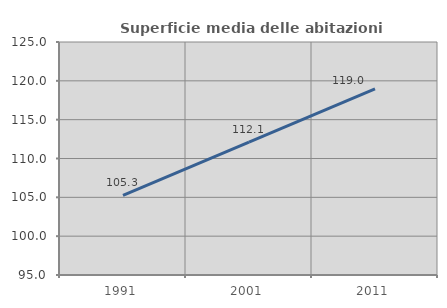
| Category | Superficie media delle abitazioni occupate |
|---|---|
| 1991.0 | 105.253 |
| 2001.0 | 112.105 |
| 2011.0 | 118.97 |